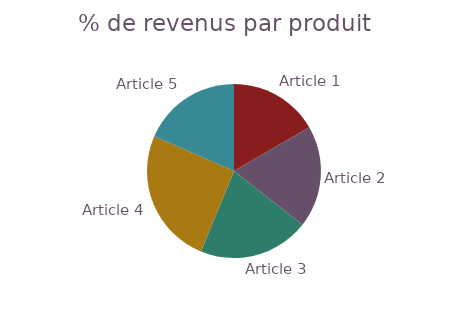
| Category | Revenu total |
|---|---|
| Article 1 | 196.75 |
| Article 2 | 224.625 |
| Article 3 | 244 |
| Article 4 | 300 |
| Article 5 | 218.4 |